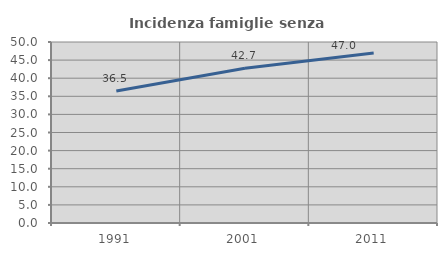
| Category | Incidenza famiglie senza nuclei |
|---|---|
| 1991.0 | 36.462 |
| 2001.0 | 42.74 |
| 2011.0 | 46.988 |